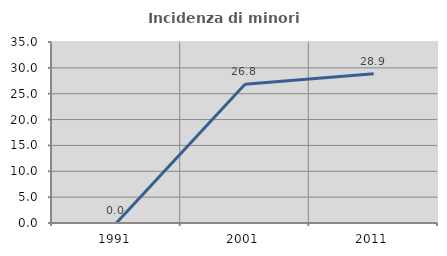
| Category | Incidenza di minori stranieri |
|---|---|
| 1991.0 | 0 |
| 2001.0 | 26.829 |
| 2011.0 | 28.873 |